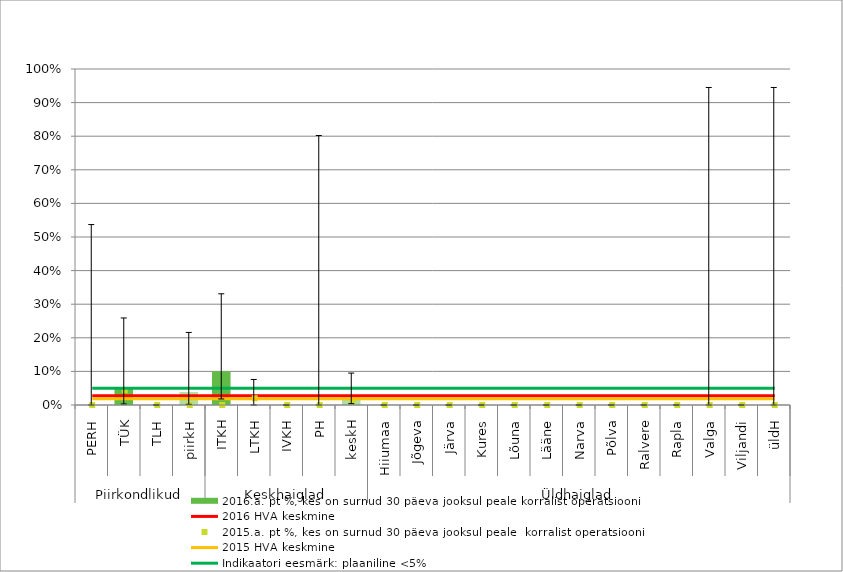
| Category | 2016.a. pt %, kes on surnud 30 päeva jooksul peale korralist operatsiooni |
|---|---|
| 0 | 0 |
| 1 | 0.048 |
| 2 | 0 |
| 3 | 0.038 |
| 4 | 0.1 |
| 5 | 0 |
| 6 | 0 |
| 7 | 0 |
| 8 | 0.025 |
| 9 | 0 |
| 10 | 0 |
| 11 | 0 |
| 12 | 0 |
| 13 | 0 |
| 14 | 0 |
| 15 | 0 |
| 16 | 0 |
| 17 | 0 |
| 18 | 0 |
| 19 | 0 |
| 20 | 0 |
| 21 | 0 |